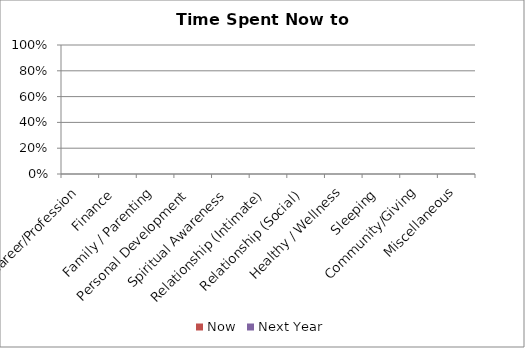
| Category | Now | Next Year |
|---|---|---|
| Career/Profession | 0 | 0 |
| Finance | 0 | 0 |
| Family / Parenting | 0 | 0 |
| Personal Development | 0 | 0 |
| Spiritual Awareness | 0 | 0 |
| Relationship (Intimate) | 0 | 0 |
| Relationship (Social) | 0 | 0 |
| Healthy / Wellness | 0 | 0 |
| Sleeping | 0 | 0 |
| Community/Giving | 0 | 0 |
| Miscellaneous | 0 | 0 |